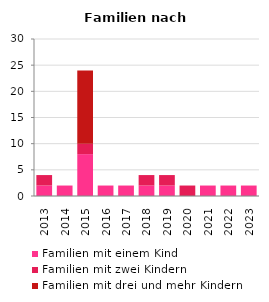
| Category | Familien mit einem Kind | Familien mit zwei Kindern | Familien mit drei und mehr Kindern |
|---|---|---|---|
| 2013.0 | 2 | 2 | 0 |
| 2014.0 | 2 | 0 | 0 |
| 2015.0 | 8 | 2 | 14 |
| 2016.0 | 2 | 0 | 0 |
| 2017.0 | 2 | 0 | 0 |
| 2018.0 | 2 | 2 | 0 |
| 2019.0 | 2 | 2 | 0 |
| 2020.0 | 0 | 2 | 0 |
| 2021.0 | 2 | 0 | 0 |
| 2022.0 | 2 | 0 | 0 |
| 2023.0 | 2 | 0 | 0 |